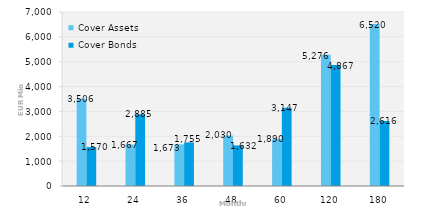
| Category | Cover Assets | Cover Bonds |
|---|---|---|
| 12.0 | 3505.525 | 1569.749 |
| 24.0 | 1666.849 | 2885.225 |
| 36.0 | 1673.486 | 1755.216 |
| 48.0 | 2030.222 | 1631.79 |
| 60.0 | 1889.557 | 3147.084 |
| 120.0 | 5275.619 | 4867.366 |
| 180.0 | 6519.92 | 2616.036 |